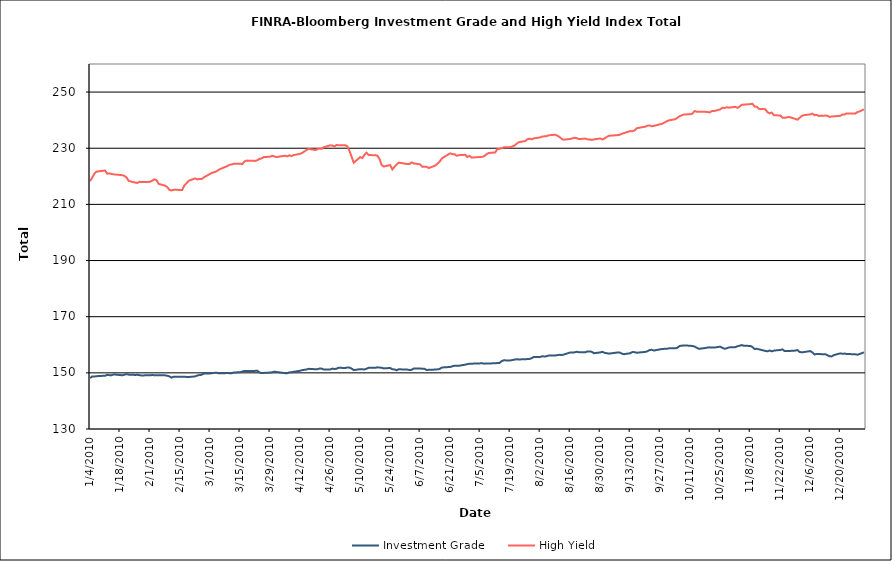
| Category | Investment Grade | High Yield |
|---|---|---|
| 1/4/10 | 148.138 | 218.276 |
| 1/5/10 | 148.728 | 219.533 |
| 1/6/10 | 148.687 | 220.973 |
| 1/7/10 | 148.791 | 221.667 |
| 1/8/10 | 148.871 | 221.768 |
| 1/11/10 | 148.965 | 222.058 |
| 1/12/10 | 149.302 | 220.936 |
| 1/13/10 | 149.169 | 221.002 |
| 1/14/10 | 149.16 | 220.851 |
| 1/15/10 | 149.443 | 220.69 |
| 1/19/10 | 149.142 | 220.408 |
| 1/20/10 | 149.341 | 220.144 |
| 1/21/10 | 149.537 | 219.594 |
| 1/22/10 | 149.358 | 218.364 |
| 1/25/10 | 149.258 | 217.768 |
| 1/26/10 | 149.302 | 217.635 |
| 1/27/10 | 149.185 | 218.028 |
| 1/28/10 | 149.057 | 217.984 |
| 1/29/10 | 149.097 | 217.958 |
| 2/1/10 | 149.11 | 218.038 |
| 2/2/10 | 149.242 | 218.46 |
| 2/3/10 | 149.11 | 218.924 |
| 2/4/10 | 149.181 | 218.611 |
| 2/5/10 | 149.188 | 217.3 |
| 2/8/10 | 149.118 | 216.652 |
| 2/9/10 | 148.96 | 216.199 |
| 2/10/10 | 148.733 | 215.145 |
| 2/11/10 | 148.306 | 214.966 |
| 2/12/10 | 148.631 | 215.187 |
| 2/16/10 | 148.612 | 215.148 |
| 2/17/10 | 148.607 | 216.754 |
| 2/18/10 | 148.543 | 217.542 |
| 2/19/10 | 148.518 | 218.407 |
| 2/22/10 | 148.735 | 219.255 |
| 2/23/10 | 149.048 | 218.904 |
| 2/24/10 | 149.199 | 219.077 |
| 2/25/10 | 149.317 | 219.009 |
| 2/26/10 | 149.72 | 219.579 |
| 3/1/10 | 149.806 | 220.874 |
| 3/2/10 | 149.879 | 221.253 |
| 3/3/10 | 149.999 | 221.505 |
| 3/4/10 | 150.058 | 221.754 |
| 3/5/10 | 149.837 | 222.349 |
| 3/8/10 | 149.871 | 223.336 |
| 3/9/10 | 149.986 | 223.623 |
| 3/10/10 | 149.839 | 224.107 |
| 3/11/10 | 149.843 | 224.21 |
| 3/12/10 | 150.118 | 224.465 |
| 3/15/10 | 150.237 | 224.508 |
| 3/16/10 | 150.455 | 224.314 |
| 3/17/10 | 150.685 | 225.249 |
| 3/18/10 | 150.697 | 225.602 |
| 3/19/10 | 150.695 | 225.533 |
| 3/22/10 | 150.701 | 225.49 |
| 3/23/10 | 150.774 | 225.713 |
| 3/24/10 | 150.157 | 226.224 |
| 3/25/10 | 149.904 | 226.327 |
| 3/26/10 | 149.978 | 226.844 |
| 3/29/10 | 150.108 | 226.98 |
| 3/30/10 | 150.193 | 227.317 |
| 3/31/10 | 150.422 | 227.06 |
| 4/1/10 | 150.302 | 226.854 |
| 4/5/10 | 149.89 | 227.336 |
| 4/6/10 | 149.886 | 227.114 |
| 4/7/10 | 150.166 | 227.482 |
| 4/8/10 | 150.222 | 227.201 |
| 4/9/10 | 150.367 | 227.559 |
| 4/12/10 | 150.743 | 228.013 |
| 4/13/10 | 150.977 | 228.362 |
| 4/14/10 | 151.082 | 228.862 |
| 4/15/10 | 151.197 | 229.417 |
| 4/16/10 | 151.43 | 229.746 |
| 4/19/10 | 151.29 | 229.378 |
| 4/20/10 | 151.303 | 229.613 |
| 4/21/10 | 151.516 | 229.922 |
| 4/22/10 | 151.505 | 229.786 |
| 4/23/10 | 151.187 | 230.343 |
| 4/26/10 | 151.183 | 231.026 |
| 4/27/10 | 151.518 | 230.985 |
| 4/28/10 | 151.375 | 230.656 |
| 4/29/10 | 151.484 | 231.163 |
| 4/30/10 | 151.823 | 231.044 |
| 5/3/10 | 151.714 | 231.082 |
| 5/4/10 | 151.911 | 230.704 |
| 5/5/10 | 151.871 | 229.082 |
| 5/6/10 | 151.518 | 226.956 |
| 5/7/10 | 150.982 | 224.839 |
| 5/10/10 | 151.305 | 226.831 |
| 5/11/10 | 151.261 | 226.496 |
| 5/12/10 | 151.206 | 227.638 |
| 5/13/10 | 151.488 | 228.391 |
| 5/14/10 | 151.808 | 227.589 |
| 5/17/10 | 151.785 | 227.491 |
| 5/18/10 | 151.962 | 227.398 |
| 5/19/10 | 151.883 | 226.231 |
| 5/20/10 | 151.828 | 224.056 |
| 5/21/10 | 151.576 | 223.475 |
| 5/24/10 | 151.744 | 224.018 |
| 5/25/10 | 151.254 | 222.441 |
| 5/26/10 | 151.228 | 223.388 |
| 5/27/10 | 150.909 | 224.158 |
| 5/28/10 | 151.267 | 224.872 |
| 6/1/10 | 151.166 | 224.359 |
| 6/2/10 | 151.005 | 224.369 |
| 6/3/10 | 151.087 | 224.964 |
| 6/4/10 | 151.536 | 224.598 |
| 6/7/10 | 151.568 | 224.254 |
| 6/8/10 | 151.449 | 223.379 |
| 6/9/10 | 151.431 | 223.411 |
| 6/10/10 | 151.033 | 223.391 |
| 6/11/10 | 151.068 | 222.938 |
| 6/14/10 | 151.168 | 223.8 |
| 6/15/10 | 151.237 | 224.435 |
| 6/16/10 | 151.35 | 225.145 |
| 6/17/10 | 151.85 | 226.255 |
| 6/18/10 | 151.95 | 226.827 |
| 6/21/10 | 152.099 | 228.18 |
| 6/22/10 | 152.336 | 227.899 |
| 6/23/10 | 152.544 | 227.893 |
| 6/24/10 | 152.505 | 227.317 |
| 6/25/10 | 152.512 | 227.529 |
| 6/28/10 | 152.919 | 227.662 |
| 6/29/10 | 153.088 | 226.881 |
| 6/30/10 | 153.256 | 227.281 |
| 7/1/10 | 153.26 | 226.657 |
| 7/2/10 | 153.296 | 226.726 |
| 7/6/10 | 153.401 | 226.935 |
| 7/7/10 | 153.275 | 227.239 |
| 7/8/10 | 153.332 | 227.914 |
| 7/9/10 | 153.346 | 228.3 |
| 7/12/10 | 153.406 | 228.5 |
| 7/13/10 | 153.508 | 229.676 |
| 7/14/10 | 153.54 | 229.747 |
| 7/15/10 | 154.186 | 230.02 |
| 7/16/10 | 154.45 | 230.311 |
| 7/19/10 | 154.421 | 230.396 |
| 7/20/10 | 154.571 | 230.597 |
| 7/21/10 | 154.713 | 230.948 |
| 7/22/10 | 154.81 | 231.615 |
| 7/23/10 | 154.787 | 232.159 |
| 7/26/10 | 154.819 | 232.551 |
| 7/27/10 | 154.919 | 233.167 |
| 7/28/10 | 154.953 | 233.424 |
| 7/29/10 | 155.219 | 233.158 |
| 7/30/10 | 155.681 | 233.528 |
| 8/2/10 | 155.664 | 233.845 |
| 8/3/10 | 155.934 | 234.218 |
| 8/4/10 | 155.819 | 234.224 |
| 8/5/10 | 155.907 | 234.331 |
| 8/6/10 | 156.202 | 234.611 |
| 8/9/10 | 156.185 | 234.826 |
| 8/10/10 | 156.305 | 234.462 |
| 8/11/10 | 156.415 | 234.013 |
| 8/12/10 | 156.375 | 233.324 |
| 8/13/10 | 156.5 | 233.036 |
| 8/16/10 | 157.283 | 233.307 |
| 8/17/10 | 157.199 | 233.51 |
| 8/18/10 | 157.299 | 233.735 |
| 8/19/10 | 157.491 | 233.606 |
| 8/20/10 | 157.371 | 233.25 |
| 8/23/10 | 157.306 | 233.433 |
| 8/24/10 | 157.642 | 233.185 |
| 8/25/10 | 157.604 | 233.111 |
| 8/26/10 | 157.53 | 232.964 |
| 8/27/10 | 157.001 | 233.13 |
| 8/30/10 | 157.269 | 233.482 |
| 8/31/10 | 157.502 | 233.106 |
| 9/1/10 | 157.137 | 233.487 |
| 9/2/10 | 156.997 | 233.998 |
| 9/3/10 | 156.836 | 234.431 |
| 9/7/10 | 157.25 | 234.672 |
| 9/8/10 | 157.273 | 234.77 |
| 9/9/10 | 156.872 | 235.138 |
| 9/10/10 | 156.635 | 235.369 |
| 9/13/10 | 157.002 | 236.122 |
| 9/14/10 | 157.428 | 236.022 |
| 9/15/10 | 157.367 | 236.341 |
| 9/16/10 | 157.163 | 237.106 |
| 9/17/10 | 157.231 | 237.261 |
| 9/20/10 | 157.459 | 237.686 |
| 9/21/10 | 157.688 | 238.039 |
| 9/22/10 | 158.121 | 238.12 |
| 9/23/10 | 158.207 | 237.83 |
| 9/24/10 | 157.946 | 237.943 |
| 9/27/10 | 158.387 | 238.553 |
| 9/28/10 | 158.5 | 238.76 |
| 9/29/10 | 158.556 | 239.176 |
| 9/30/10 | 158.574 | 239.596 |
| 10/1/10 | 158.719 | 239.917 |
| 10/4/10 | 158.723 | 240.343 |
| 10/5/10 | 158.915 | 240.842 |
| 10/6/10 | 159.572 | 241.409 |
| 10/7/10 | 159.662 | 241.712 |
| 10/8/10 | 159.778 | 242.02 |
| 10/11/10 | 159.647 | 242.1 |
| 10/12/10 | 159.547 | 242.33 |
| 10/13/10 | 159.368 | 243.238 |
| 10/14/10 | 158.936 | 243.015 |
| 10/15/10 | 158.56 | 242.955 |
| 10/18/10 | 158.841 | 242.956 |
| 10/19/10 | 159.018 | 242.909 |
| 10/20/10 | 159.081 | 242.726 |
| 10/21/10 | 159 | 243.221 |
| 10/22/10 | 158.985 | 243.231 |
| 10/25/10 | 159.316 | 243.831 |
| 10/26/10 | 158.883 | 244.418 |
| 10/27/10 | 158.57 | 244.341 |
| 10/28/10 | 158.749 | 244.582 |
| 10/29/10 | 159.062 | 244.452 |
| 11/1/10 | 159.158 | 244.733 |
| 11/2/10 | 159.471 | 244.362 |
| 11/3/10 | 159.656 | 244.821 |
| 11/4/10 | 159.896 | 245.495 |
| 11/5/10 | 159.653 | 245.54 |
| 11/8/10 | 159.578 | 245.717 |
| 11/9/10 | 159.213 | 245.828 |
| 11/10/10 | 158.489 | 244.84 |
| 11/11/10 | 158.591 | 244.793 |
| 11/12/10 | 158.389 | 244.031 |
| 11/15/10 | 157.814 | 243.894 |
| 11/16/10 | 157.664 | 242.835 |
| 11/17/10 | 157.963 | 242.423 |
| 11/18/10 | 157.658 | 242.693 |
| 11/19/10 | 157.922 | 241.761 |
| 11/22/10 | 158.162 | 241.668 |
| 11/23/10 | 158.357 | 240.889 |
| 11/24/10 | 157.748 | 240.806 |
| 11/26/10 | 157.77 | 241.172 |
| 11/29/10 | 157.93 | 240.436 |
| 11/30/10 | 158.106 | 240.163 |
| 12/1/10 | 157.436 | 240.816 |
| 12/2/10 | 157.319 | 241.508 |
| 12/3/10 | 157.409 | 241.776 |
| 12/6/10 | 157.748 | 242.064 |
| 12/7/10 | 157.248 | 242.309 |
| 12/8/10 | 156.543 | 241.78 |
| 12/9/10 | 156.743 | 241.89 |
| 12/10/10 | 156.679 | 241.503 |
| 12/13/10 | 156.633 | 241.636 |
| 12/14/10 | 156.258 | 241.537 |
| 12/15/10 | 155.875 | 241.161 |
| 12/16/10 | 155.864 | 241.32 |
| 12/17/10 | 156.338 | 241.362 |
| 12/20/10 | 156.934 | 241.546 |
| 12/21/10 | 156.801 | 242.022 |
| 12/22/10 | 156.866 | 242.026 |
| 12/23/10 | 156.734 | 242.402 |
| 12/27/10 | 156.592 | 242.345 |
| 12/28/10 | 156.46 | 242.906 |
| 12/29/10 | 156.734 | 243.104 |
| 12/30/10 | 157 | 243.491 |
| 12/31/10 | 157.322 | 243.889 |